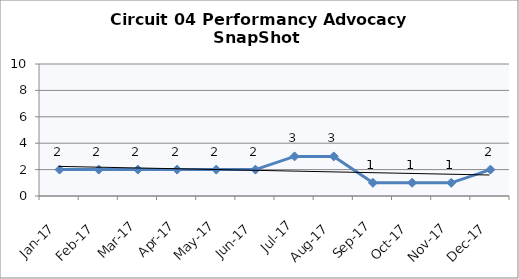
| Category | Circuit 04 |
|---|---|
| Jan-17 | 2 |
| Feb-17 | 2 |
| Mar-17 | 2 |
| Apr-17 | 2 |
| May-17 | 2 |
| Jun-17 | 2 |
| Jul-17 | 3 |
| Aug-17 | 3 |
| Sep-17 | 1 |
| Oct-17 | 1 |
| Nov-17 | 1 |
| Dec-17 | 2 |